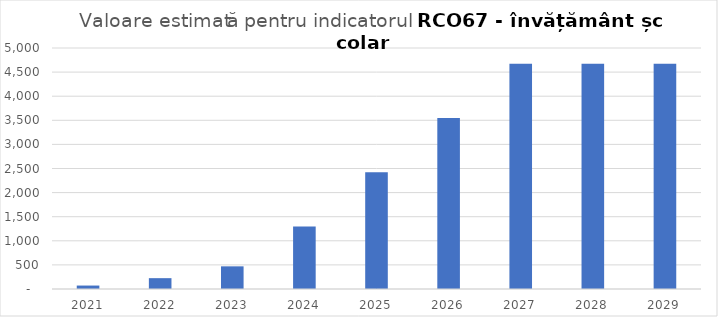
| Category | Series 0 |
|---|---|
| 2021.0 | 71.544 |
| 2022.0 | 224.853 |
| 2023.0 | 470.147 |
| 2024.0 | 1298.015 |
| 2025.0 | 2422.28 |
| 2026.0 | 3546.546 |
| 2027.0 | 4670.811 |
| 2028.0 | 4670.811 |
| 2029.0 | 4670.811 |